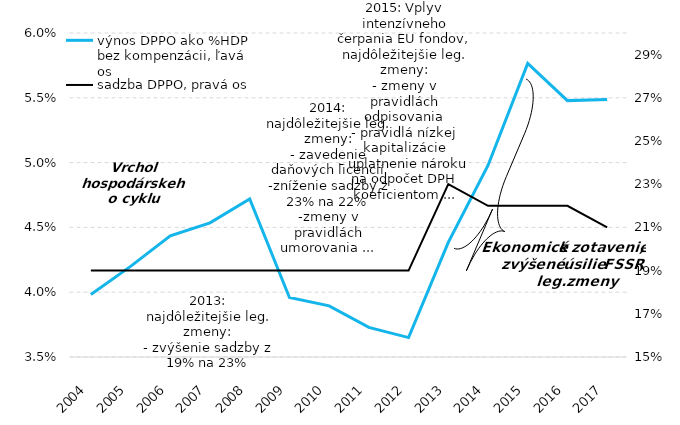
| Category | výnos DPPO ako %HDP bez kompenzácii, ľavá os |
|---|---|
| 2004.0 | 0.04 |
| 2005.0 | 0.042 |
| 2006.0 | 0.044 |
| 2007.0 | 0.045 |
| 2008.0 | 0.047 |
| 2009.0 | 0.04 |
| 2010.0 | 0.039 |
| 2011.0 | 0.037 |
| 2012.0 | 0.036 |
| 2013.0 | 0.044 |
| 2014.0 | 0.05 |
| 2015.0 | 0.058 |
| 2016.0 | 0.055 |
| 2017.0 | 0.055 |